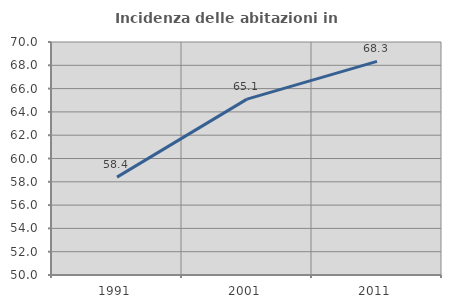
| Category | Incidenza delle abitazioni in proprietà  |
|---|---|
| 1991.0 | 58.399 |
| 2001.0 | 65.099 |
| 2011.0 | 68.339 |